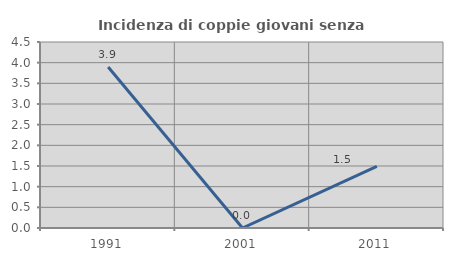
| Category | Incidenza di coppie giovani senza figli |
|---|---|
| 1991.0 | 3.896 |
| 2001.0 | 0 |
| 2011.0 | 1.493 |